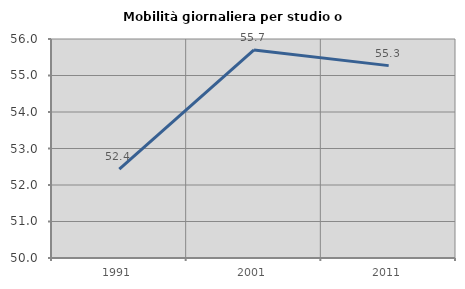
| Category | Mobilità giornaliera per studio o lavoro |
|---|---|
| 1991.0 | 52.435 |
| 2001.0 | 55.699 |
| 2011.0 | 55.271 |